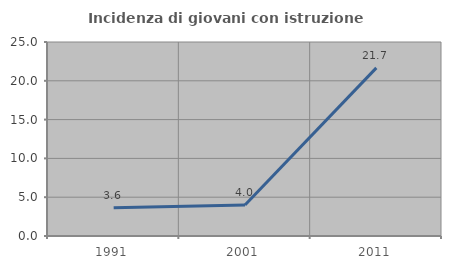
| Category | Incidenza di giovani con istruzione universitaria |
|---|---|
| 1991.0 | 3.636 |
| 2001.0 | 4 |
| 2011.0 | 21.667 |